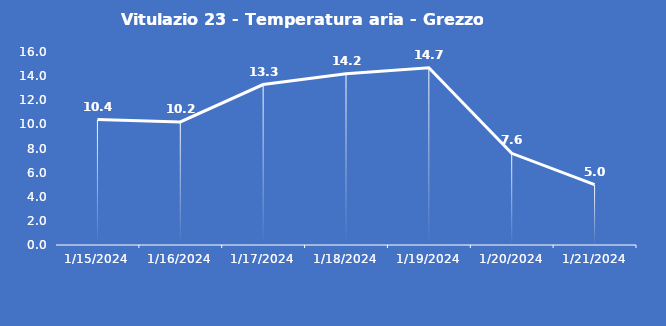
| Category | Vitulazio 23 - Temperatura aria - Grezzo (°C) |
|---|---|
| 1/15/24 | 10.4 |
| 1/16/24 | 10.2 |
| 1/17/24 | 13.3 |
| 1/18/24 | 14.2 |
| 1/19/24 | 14.7 |
| 1/20/24 | 7.6 |
| 1/21/24 | 5 |